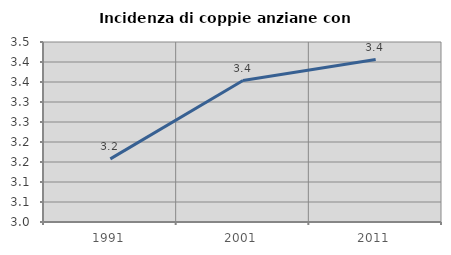
| Category | Incidenza di coppie anziane con figli |
|---|---|
| 1991.0 | 3.158 |
| 2001.0 | 3.354 |
| 2011.0 | 3.406 |